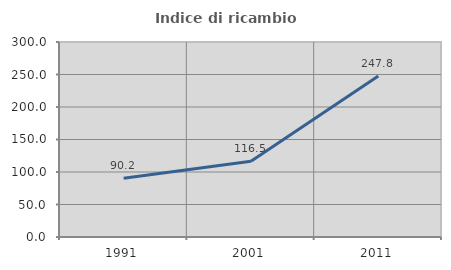
| Category | Indice di ricambio occupazionale  |
|---|---|
| 1991.0 | 90.233 |
| 2001.0 | 116.544 |
| 2011.0 | 247.807 |